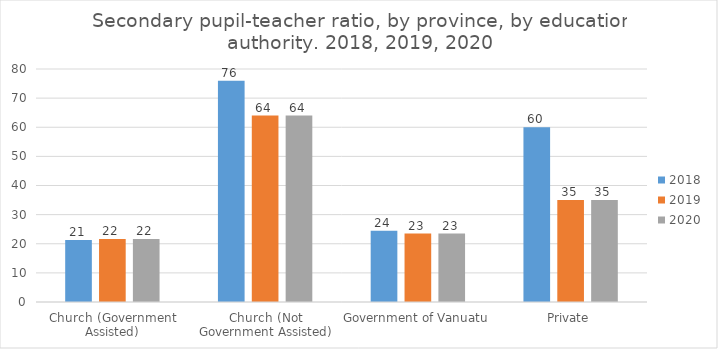
| Category | 2018 | 2019 | 2020 |
|---|---|---|---|
| Church (Government Assisted) | 21.261 | 21.638 | 21.638 |
| Church (Not Government Assisted) | 76 | 64 | 64 |
| Government of Vanuatu | 24.453 | 23.489 | 23.489 |
| Private | 60 | 35 | 35 |